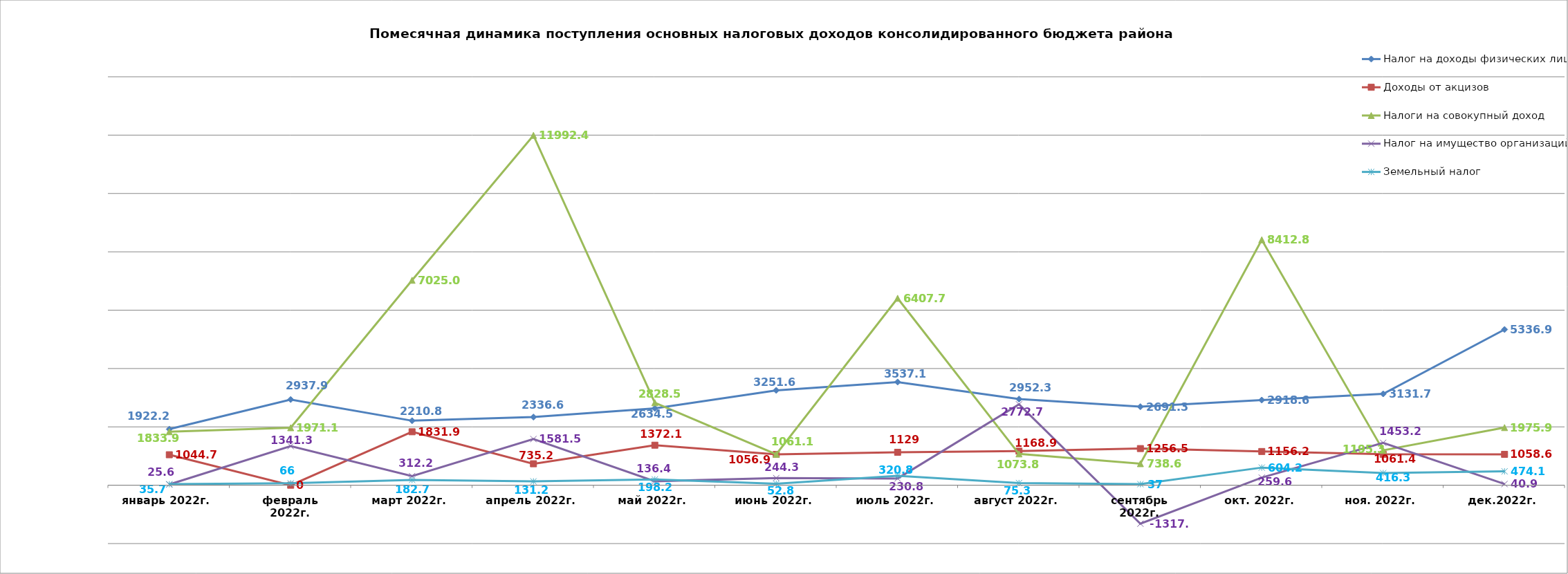
| Category | Налог на доходы физических лиц | Доходы от акцизов | Налоги на совокупный доход | Налог на имущество организаций | Земельный налог |
|---|---|---|---|---|---|
| январь 2022г. | 1922.2 | 1044.7 | 1833.9 | 25.6 | 35.7 |
| февраль 2022г. | 2937.9 | 0 | 1971.1 | 1341.3 | 66 |
| март 2022г. | 2210.8 | 1831.9 | 7025 | 312.2 | 182.7 |
| апрель 2022г. | 2336.6 | 735.2 | 11992.4 | 1581.5 | 131.2 |
| май 2022г. | 2634.5 | 1372.1 | 2828.5 | 136.4 | 198.2 |
| июнь 2022г. | 3251.6 | 1056.9 | 1061.1 | 244.3 | 52.8 |
| июль 2022г. | 3537.1 | 1129 | 6407.7 | 230.8 | 320.8 |
| август 2022г. | 2952.3 | 1168.9 | 1073.8 | 2772.7 | 75.3 |
| сентябрь 2022г. | 2691.3 | 1256.5 | 738.6 | -1317.6 | 37 |
| окт. 2022г. | 2918.6 | 1156.2 | 8412.8 | 259.6 | 604.2 |
| ноя. 2022г. | 3131.7 | 1061.4 | 1195.3 | 1453.2 | 416.3 |
| дек.2022г. | 5336.9 | 1058.6 | 1975.9 | 40.9 | 474.1 |